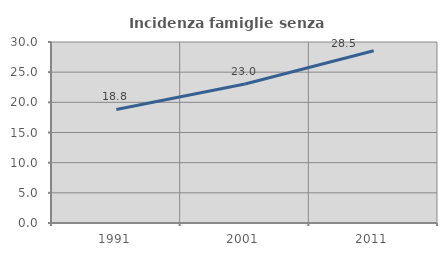
| Category | Incidenza famiglie senza nuclei |
|---|---|
| 1991.0 | 18.814 |
| 2001.0 | 23.028 |
| 2011.0 | 28.538 |